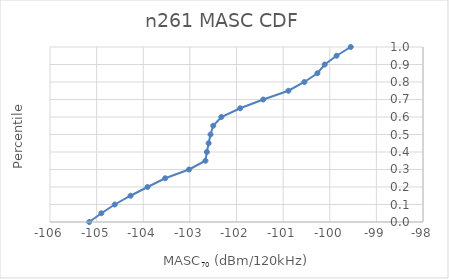
| Category | n261 |
|---|---|
| -105.159215780241 | 0 |
| -104.8980863120964 | 0.05 |
| -104.6112 | 0.1 |
| -104.2728 | 0.15 |
| -103.908 | 0.2 |
| -103.53 | 0.25 |
| -103.01784 | 0.3 |
| -102.6661 | 0.35 |
| -102.6352 | 0.4 |
| -102.59799440717065 | 0.45 |
| -102.55763601792663 | 0.5 |
| -102.49905440717065 | 0.55 |
| -102.32531110898779 | 0.6 |
| -101.92124443595121 | 0.65 |
| -101.4264133269634 | 0.7 |
| -100.8862 | 0.75 |
| -100.54456 | 0.8 |
| -100.26476 | 0.85 |
| -100.10864000000001 | 0.9 |
| -99.85396 | 0.95 |
| -99.55 | 1 |